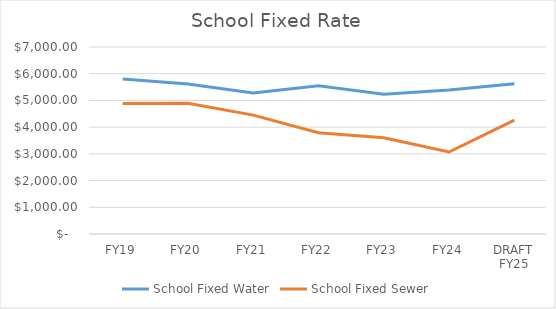
| Category | School Fixed Water | School Fixed Sewer |
|---|---|---|
| FY19 | 5803.97 | 4887.19 |
| FY20 | 5615.143 | 4892.444 |
| FY21 | 5277.83 | 4450.025 |
| FY22 | 5549.135 | 3789.274 |
| FY23 | 5233.025 | 3599.215 |
| FY24 | 5390.784 | 3068.2 |
| DRAFT FY25 | 5626.97 | 4262.62 |